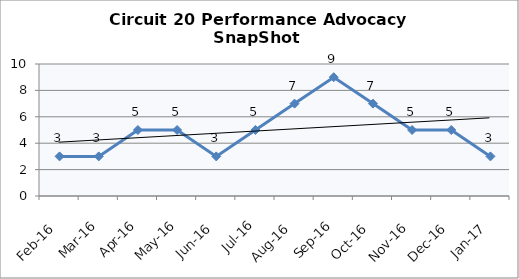
| Category | Circuit 20 |
|---|---|
| Feb-16 | 3 |
| Mar-16 | 3 |
| Apr-16 | 5 |
| May-16 | 5 |
| Jun-16 | 3 |
| Jul-16 | 5 |
| Aug-16 | 7 |
| Sep-16 | 9 |
| Oct-16 | 7 |
| Nov-16 | 5 |
| Dec-16 | 5 |
| Jan-17 | 3 |